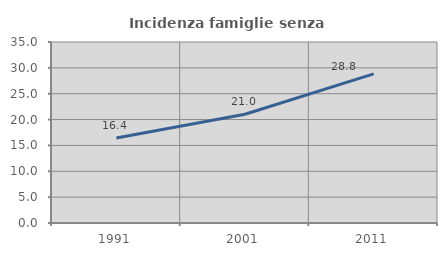
| Category | Incidenza famiglie senza nuclei |
|---|---|
| 1991.0 | 16.422 |
| 2001.0 | 21.03 |
| 2011.0 | 28.827 |